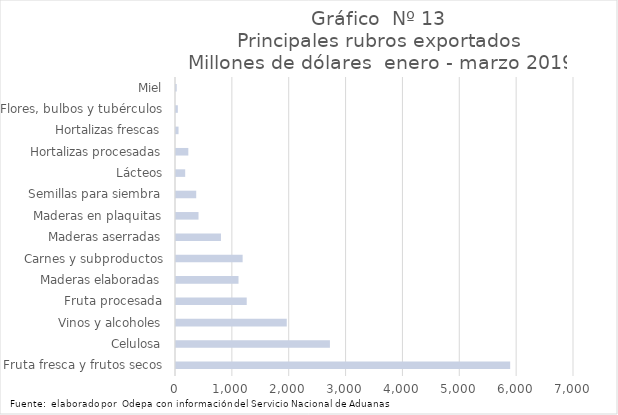
| Category | Series 7 |
|---|---|
| Fruta fresca y frutos secos | 5877594.762 |
| Celulosa | 2707289.401 |
| Vinos y alcoholes | 1948119.464 |
| Fruta procesada | 1244057.409 |
| Maderas elaboradas | 1099266.463 |
| Carnes y subproductos | 1171959.593 |
| Maderas aserradas | 790775.053 |
| Maderas en plaquitas | 395868.178 |
| Semillas para siembra | 355553.496 |
| Lácteos | 161407.084 |
| Hortalizas procesadas | 216612.418 |
| Hortalizas frescas | 44599.858 |
| Flores, bulbos y tubérculos | 32352.249 |
| Miel | 12516.602 |